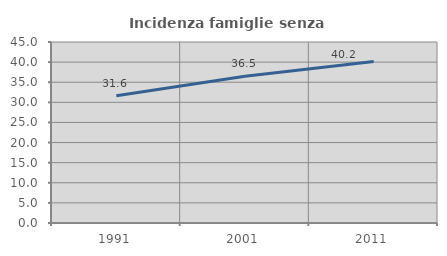
| Category | Incidenza famiglie senza nuclei |
|---|---|
| 1991.0 | 31.61 |
| 2001.0 | 36.496 |
| 2011.0 | 40.169 |